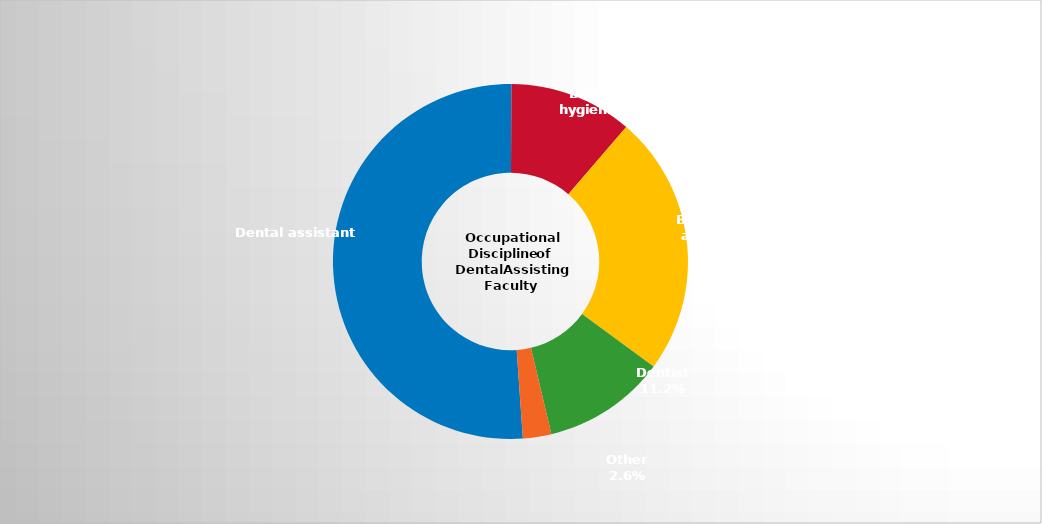
| Category | Series 2 |
|---|---|
| Dental assistant   | 0.512 |
| Dental hygienist | 0.112 |
| Both dental hygienist and dental assistant | 0.238 |
| Dentist | 0.112 |
| Other | 0.026 |